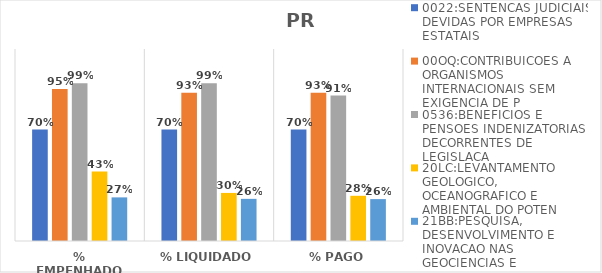
| Category | 0022:SENTENCAS JUDICIAIS DEVIDAS POR EMPRESAS ESTATAIS | 00OQ:CONTRIBUICOES A ORGANISMOS INTERNACIONAIS SEM EXIGENCIA DE P | 0536:BENEFICIOS E PENSOES INDENIZATORIAS DECORRENTES DE LEGISLACA | 20LC:LEVANTAMENTO GEOLOGICO, OCEANOGRAFICO E AMBIENTAL DO POTEN | 21BB:PESQUISA, DESENVOLVIMENTO E INOVACAO NAS GEOCIENCIAS E |
|---|---|---|---|---|---|
| % EMPENHADO | 0.697 | 0.95 | 0.985 | 0.434 | 0.273 |
| % LIQUIDADO | 0.697 | 0.926 | 0.985 | 0.3 | 0.263 |
| % PAGO | 0.697 | 0.926 | 0.909 | 0.282 | 0.262 |